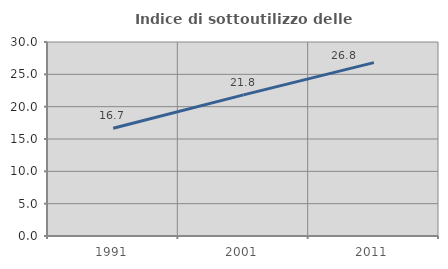
| Category | Indice di sottoutilizzo delle abitazioni  |
|---|---|
| 1991.0 | 16.667 |
| 2001.0 | 21.825 |
| 2011.0 | 26.809 |